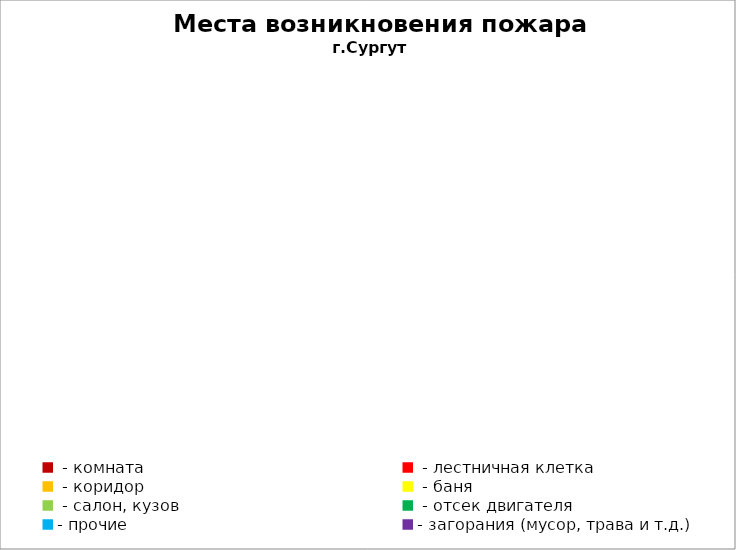
| Category | Места возникновения пожара |
|---|---|
|  - комната | 29 |
|  - лестничная клетка | 3 |
|  - коридор | 7 |
|  - баня | 9 |
|  - салон, кузов | 15 |
|  - отсек двигателя | 27 |
| - прочие | 89 |
| - загорания (мусор, трава и т.д.)  | 82 |